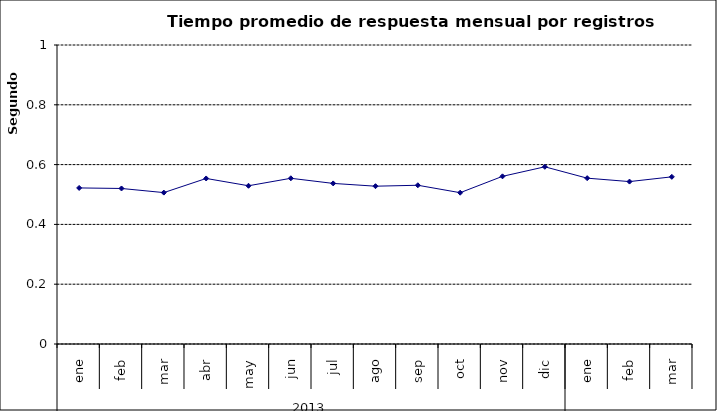
| Category | Tiempo promedio de respuesta por registros cámara PH ** |
|---|---|
| 0 | 0.522 |
| 1 | 0.52 |
| 2 | 0.506 |
| 3 | 0.554 |
| 4 | 0.529 |
| 5 | 0.554 |
| 6 | 0.537 |
| 7 | 0.528 |
| 8 | 0.531 |
| 9 | 0.506 |
| 10 | 0.561 |
| 11 | 0.593 |
| 12 | 0.555 |
| 13 | 0.543 |
| 14 | 0.559 |